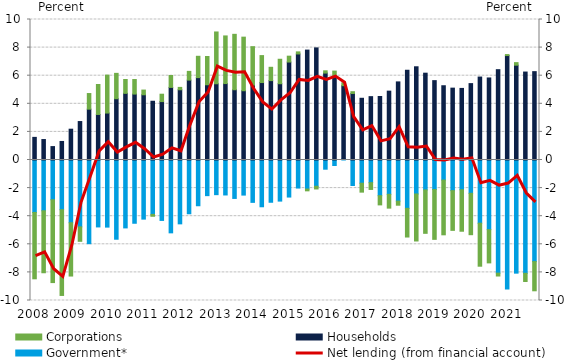
| Category | Government* | Households | Corporations |
|---|---|---|---|
| 2008.0 | -3.734 | 1.61 | -4.722 |
| nan | -3.614 | 1.456 | -4.411 |
| nan | -2.83 | 0.954 | -5.895 |
| nan | -3.538 | 1.32 | -6.102 |
| 2009.0 | -4.465 | 2.192 | -3.794 |
| nan | -4.759 | 2.737 | -1.028 |
| nan | -5.956 | 3.618 | 1.113 |
| nan | -4.764 | 3.242 | 2.132 |
| 2010.0 | -4.776 | 3.342 | 2.7 |
| nan | -5.639 | 4.362 | 1.805 |
| nan | -4.833 | 4.744 | 0.987 |
| nan | -4.502 | 4.691 | 1.036 |
| 2011.0 | -4.208 | 4.642 | 0.335 |
| nan | -3.872 | 4.181 | -0.133 |
| nan | -4.3 | 4.157 | 0.526 |
| nan | -5.185 | 5.167 | 0.849 |
| 2012.0 | -4.545 | 4.999 | 0.168 |
| nan | -3.826 | 5.688 | 0.62 |
| nan | -3.256 | 5.863 | 1.518 |
| nan | -2.537 | 5.355 | 2.012 |
| 2013.0 | -2.467 | 5.427 | 3.686 |
| nan | -2.489 | 5.44 | 3.39 |
| nan | -2.735 | 5.001 | 3.944 |
| nan | -2.497 | 4.93 | 3.814 |
| 2014.0 | -3.015 | 5.331 | 2.735 |
| nan | -3.329 | 5.513 | 1.918 |
| nan | -3.008 | 5.65 | 0.948 |
| nan | -2.925 | 5.43 | 1.74 |
| 2015.0 | -2.637 | 6.972 | 0.418 |
| nan | -1.996 | 7.547 | 0.15 |
| nan | -2.068 | 7.823 | -0.127 |
| nan | -1.869 | 7.978 | -0.192 |
| 2016.0 | -0.655 | 6.187 | 0.161 |
| nan | -0.392 | 5.956 | 0.372 |
| nan | 0.088 | 5.202 | 0.207 |
| nan | -1.814 | 4.734 | 0.127 |
| 2017.0 | -1.653 | 4.393 | -0.635 |
| nan | -1.613 | 4.509 | -0.482 |
| nan | -2.541 | 4.521 | -0.654 |
| nan | -2.444 | 4.901 | -0.982 |
| 2018.0 | -2.929 | 5.559 | -0.289 |
| nan | -3.441 | 6.388 | -2.041 |
| nan | -2.419 | 6.635 | -3.345 |
| nan | -2.132 | 6.178 | -3.087 |
| 2019.0 | -2.104 | 5.649 | -3.544 |
| nan | -1.429 | 5.285 | -3.896 |
| nan | -2.181 | 5.115 | -2.827 |
| nan | -2.117 | 5.095 | -2.953 |
| 2020.0 | -2.371 | 5.437 | -2.945 |
| nan | -4.499 | 5.904 | -3.06 |
| nan | -4.957 | 5.839 | -2.366 |
| nan | -8.054 | 6.429 | -0.203 |
| 2021.0 | -9.179 | 7.434 | 0.07 |
| nan | -8.054 | 6.749 | 0.182 |
| nan | -8.066 | 6.26 | -0.58 |
| nan | -7.23 | 6.289 | -2.08 |